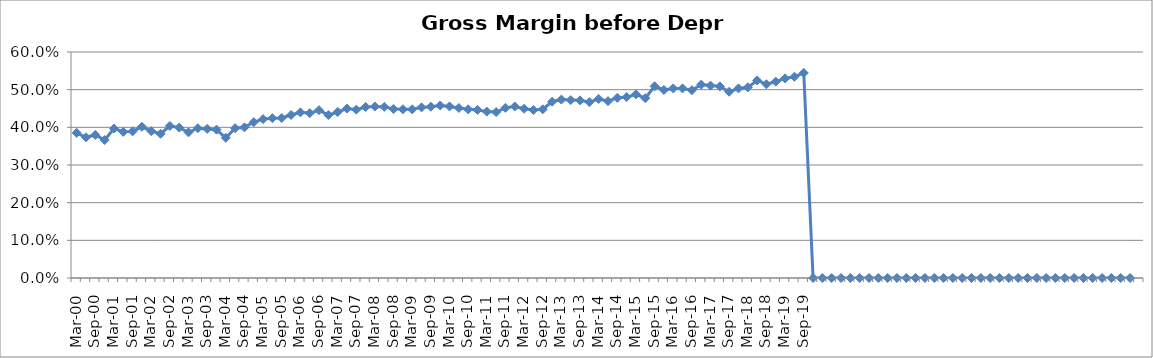
| Category | Gross Margin (before depr) % |
|---|---|
| Mar-00 | 0.385 |
| Jun-00 | 0.374 |
| Sep-00 | 0.38 |
| Dec-00 | 0.366 |
| Mar-01 | 0.397 |
| Jun-01 | 0.388 |
| Sep-01 | 0.389 |
| Dec-01 | 0.401 |
| Mar-02 | 0.39 |
| Jun-02 | 0.383 |
| Sep-02 | 0.404 |
| Dec-02 | 0.399 |
| Mar-03 | 0.387 |
| Jun-03 | 0.398 |
| Sep-03 | 0.396 |
| Dec-03 | 0.394 |
| Mar-04 | 0.372 |
| Jun-04 | 0.398 |
| Sep-04 | 0.4 |
| Dec-04 | 0.414 |
| Mar-05 | 0.422 |
| Jun-05 | 0.424 |
| Sep-05 | 0.425 |
| Dec-05 | 0.433 |
| Mar-06 | 0.44 |
| Jun-06 | 0.438 |
| Sep-06 | 0.446 |
| Dec-06 | 0.433 |
| Mar-07 | 0.441 |
| Jun-07 | 0.45 |
| Sep-07 | 0.447 |
| Dec-07 | 0.454 |
| Mar-08 | 0.455 |
| Jun-08 | 0.454 |
| Sep-08 | 0.449 |
| Dec-08 | 0.448 |
| Mar-09 | 0.448 |
| Jun-09 | 0.453 |
| Sep-09 | 0.455 |
| Dec-09 | 0.458 |
| Mar-10 | 0.455 |
| Jun-10 | 0.451 |
| Sep-10 | 0.448 |
| Dec-10 | 0.446 |
| Mar-11 | 0.442 |
| Jun-11 | 0.441 |
| Sep-11 | 0.452 |
| Dec-11 | 0.455 |
| Mar-12 | 0.449 |
| Jun-12 | 0.446 |
| Sep-12 | 0.448 |
| Dec-12 | 0.468 |
| Mar-13 | 0.474 |
| Jun-13 | 0.472 |
| Sep-13 | 0.472 |
| Dec-13 | 0.467 |
| Mar-14 | 0.475 |
| Jun-14 | 0.469 |
| Sep-14 | 0.478 |
| Dec-14 | 0.48 |
| Mar-15 | 0.488 |
| Jun-15 | 0.477 |
| Sep-15 | 0.509 |
| Dec-15 | 0.499 |
| Mar-16 | 0.503 |
| Jun-16 | 0.503 |
| Sep-16 | 0.499 |
| Dec-16 | 0.513 |
| Mar-17 | 0.511 |
| Jun-17 | 0.509 |
| Sep-17 | 0.494 |
| Dec-17 | 0.503 |
| Mar-18 | 0.506 |
| Jun-18 | 0.525 |
| Sep-18 | 0.514 |
| Dec-18 | 0.521 |
| Mar-19 | 0.53 |
| Jun-19 | 0.534 |
| Sep-19 | 0.545 |